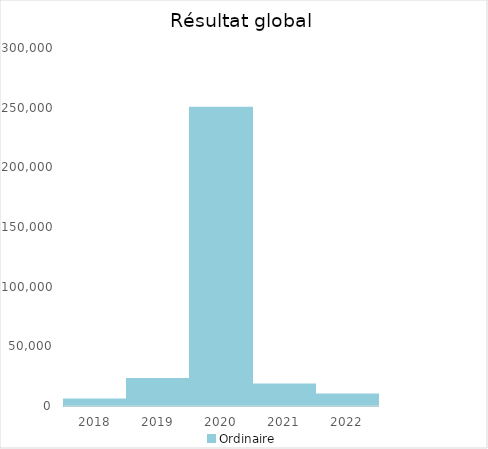
| Category |   | Ordinaire |    |
|---|---|---|---|
| 2018.0 |  | 5454.98 |  |
| 2019.0 |  | 22549.55 |  |
| 2020.0 |  | 249998.12 |  |
| 2021.0 |  | 18010.98 |  |
| 2022.0 |  | 9617.7 |  |